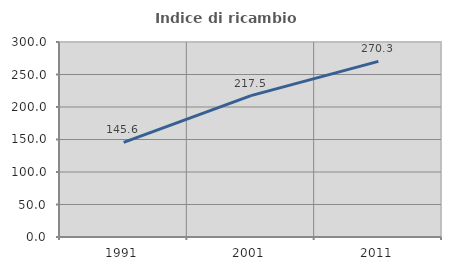
| Category | Indice di ricambio occupazionale  |
|---|---|
| 1991.0 | 145.588 |
| 2001.0 | 217.5 |
| 2011.0 | 270.27 |